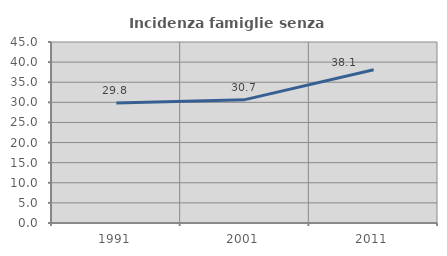
| Category | Incidenza famiglie senza nuclei |
|---|---|
| 1991.0 | 29.832 |
| 2001.0 | 30.667 |
| 2011.0 | 38.117 |